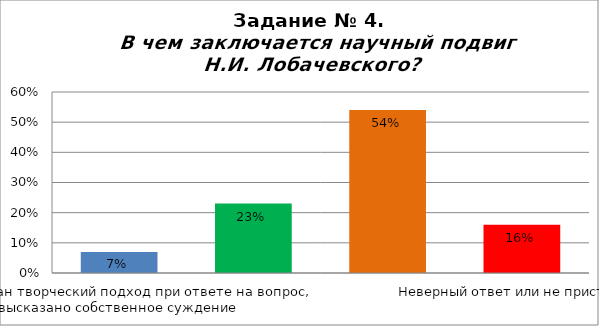
| Category | В чем заключается научный подвиг Н.И. Лобачевского? |
|---|---|
| Использован творческий подход при ответе на вопрос, высказано собственное суждение | 0.07 |
| При ответе на вопрос использованы материалы текста, без собственной оценки событий | 0.23 |
| Краткий ответ | 0.54 |
| Неверный ответ или не приступал | 0.16 |